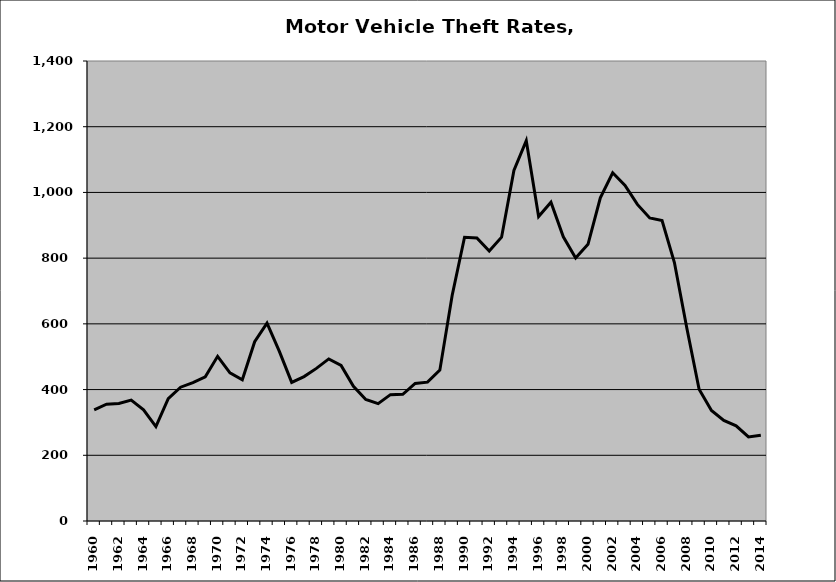
| Category | Motor Vehicle |
|---|---|
| 1960.0 | 338.361 |
| 1961.0 | 355.356 |
| 1962.0 | 357.588 |
| 1963.0 | 367.992 |
| 1964.0 | 338.267 |
| 1965.0 | 287.313 |
| 1966.0 | 372.311 |
| 1967.0 | 407.222 |
| 1968.0 | 421.198 |
| 1969.0 | 438.63 |
| 1970.0 | 501.162 |
| 1971.0 | 450.838 |
| 1972.0 | 429.769 |
| 1973.0 | 545.578 |
| 1974.0 | 602.322 |
| 1975.0 | 516.097 |
| 1976.0 | 421.806 |
| 1977.0 | 439.503 |
| 1978.0 | 464.444 |
| 1979.0 | 493.265 |
| 1980.0 | 473.308 |
| 1981.0 | 409.989 |
| 1982.0 | 369.825 |
| 1983.0 | 357.037 |
| 1984.0 | 384.507 |
| 1985.0 | 385.504 |
| 1986.0 | 418.812 |
| 1987.0 | 422.563 |
| 1988.0 | 459.146 |
| 1989.0 | 686.895 |
| 1990.0 | 863.466 |
| 1991.0 | 861.093 |
| 1992.0 | 821.529 |
| 1993.0 | 863.77 |
| 1994.0 | 1066.675 |
| 1995.0 | 1157.658 |
| 1996.0 | 926.694 |
| 1997.0 | 970.384 |
| 1998.0 | 865.089 |
| 1999.0 | 800.426 |
| 2000.0 | 842.079 |
| 2001.0 | 983.669 |
| 2002.0 | 1059.854 |
| 2003.0 | 1021.594 |
| 2004.0 | 963.539 |
| 2005.0 | 922.307 |
| 2006.0 | 914.403 |
| 2007.0 | 786.7 |
| 2008.0 | 587.918 |
| 2009.0 | 400.817 |
| 2010.0 | 336.482 |
| 2011.0 | 306.17 |
| 2012.0 | 289.751 |
| 2013.0 | 255.705 |
| 2014.0 | 261.265 |